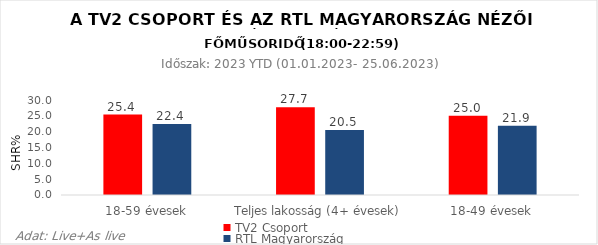
| Category | TV2 Csoport | RTL Magyarország |
|---|---|---|
| 18-59 évesek | 25.4 | 22.4 |
| Teljes lakosság (4+ évesek) | 27.7 | 20.5 |
| 18-49 évesek | 25 | 21.9 |